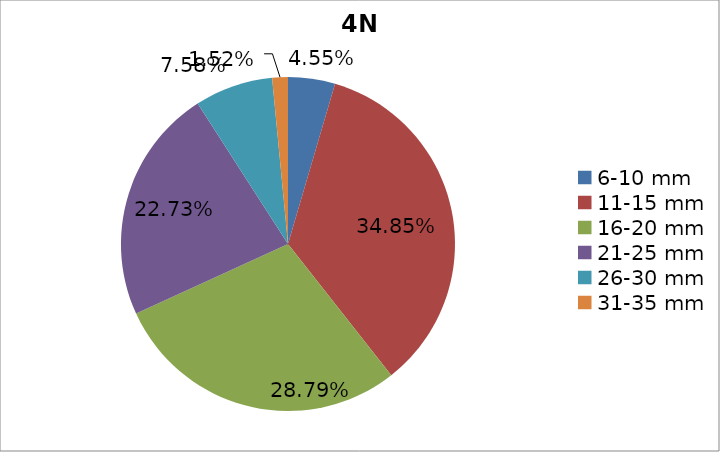
| Category | Series 0 |
|---|---|
| 6-10 mm | 0.046 |
| 11-15 mm | 0.348 |
| 16-20 mm | 0.288 |
| 21-25 mm | 0.227 |
| 26-30 mm | 0.076 |
| 31-35 mm | 0.015 |